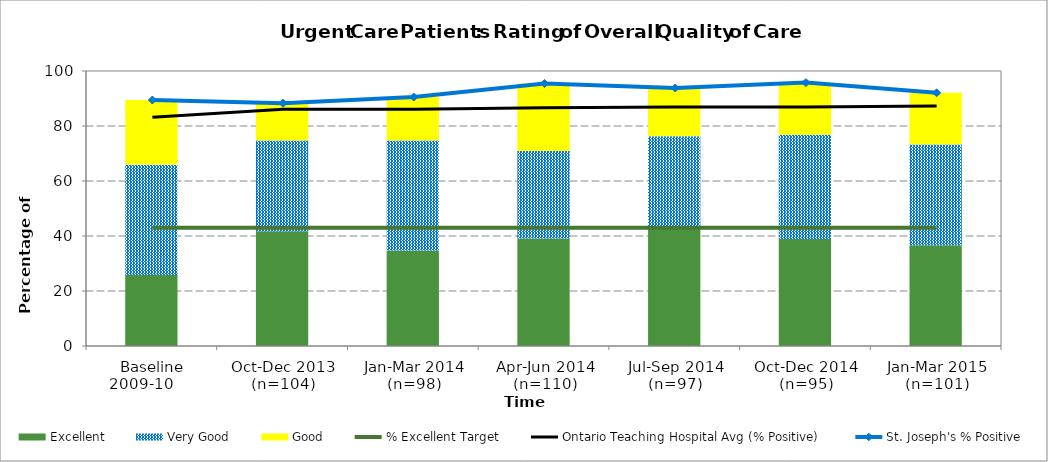
| Category | Excellent | Very Good | Good |
|---|---|---|---|
| Baseline 2009-10      | 25.86 | 40.03 | 23.56 |
| Oct-Dec 2013 (n=104) | 41.7 | 33 | 13.6 |
| Jan-Mar 2014 (n=98) | 34.74 | 40 | 15.79 |
| Apr-Jun 2014 (n=110) | 39.09 | 31.82 | 24.55 |
| Jul-Sep 2014 (n=97) | 43.3 | 32.99 | 17.53 |
| Oct-Dec 2014 (n=95) | 38.95 | 37.89 | 18.95 |
| Jan-Mar 2015 (n=101) | 36.63 | 36.63 | 18.81 |